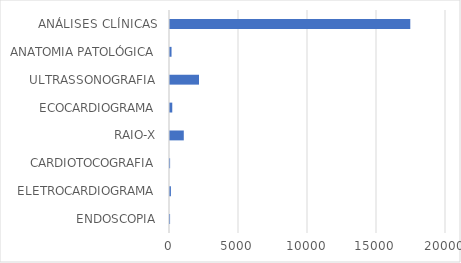
| Category | Series 0 |
|---|---|
| ENDOSCOPIA | 5 |
| ELETROCARDIOGRAMA | 66 |
| CARDIOTOCOGRAFIA | 7 |
| RAIO-X | 999 |
| ECOCARDIOGRAMA | 164 |
| ULTRASSONOGRAFIA | 2103 |
| ANATOMIA PATOLÓGICA | 111 |
| ANÁLISES CLÍNICAS | 17412 |